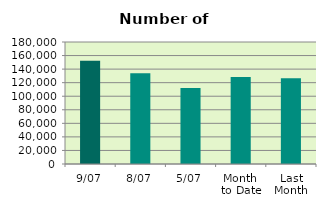
| Category | Series 0 |
|---|---|
| 9/07 | 152480 |
| 8/07 | 133864 |
| 5/07 | 112126 |
| Month 
to Date | 128446.857 |
| Last
Month | 126531 |